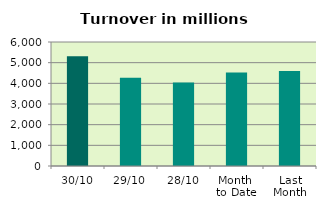
| Category | Series 0 |
|---|---|
| 30/10 | 5307.956 |
| 29/10 | 4266.923 |
| 28/10 | 4045.66 |
| Month 
to Date | 4523.829 |
| Last
Month | 4598.075 |